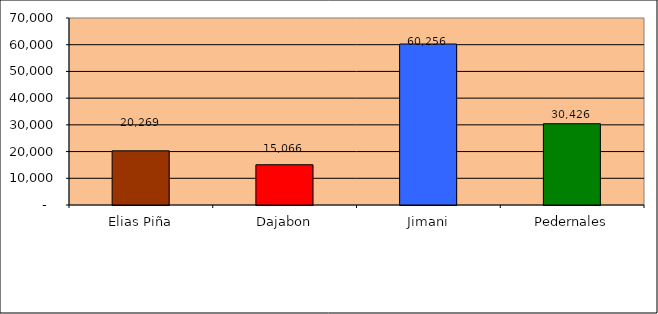
| Category | Series 0 |
|---|---|
| Elias Piña | 20269 |
| Dajabon | 15066 |
| Jimani | 60256 |
| Pedernales | 30426 |